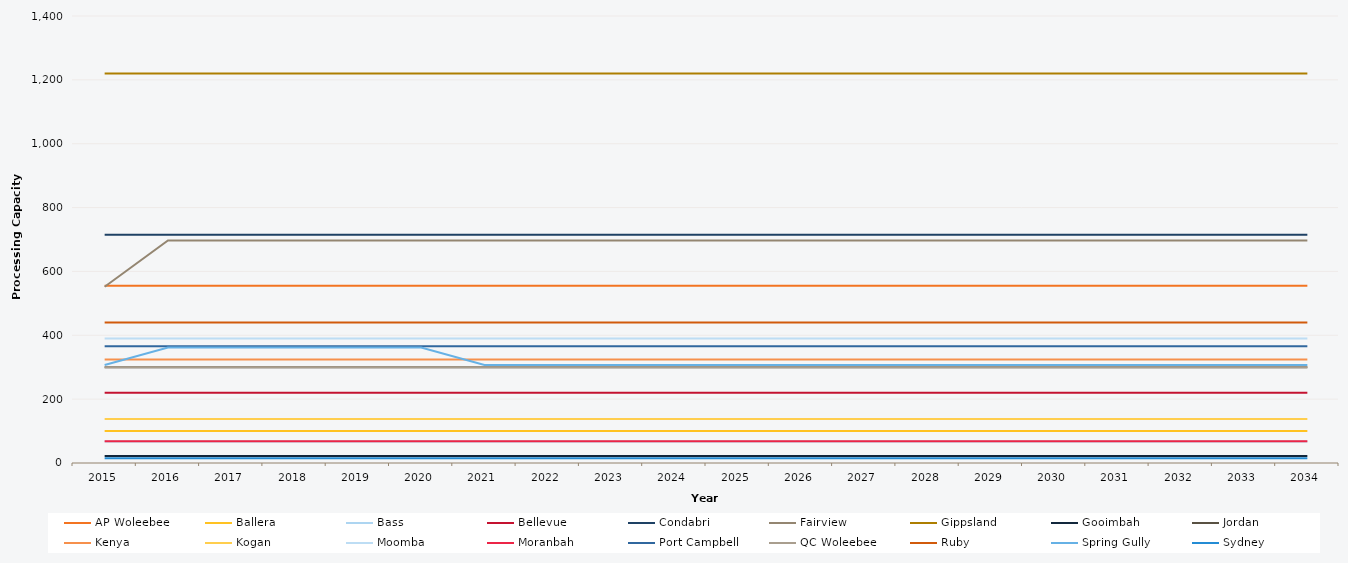
| Category | AP Woleebee | Ballera | Bass | Bellevue | Condabri | Fairview | Gippsland | Gooimbah | Jordan | Kenya | Kogan | Moomba | Moranbah | Port Campbell | QC Woleebee | Ruby | Spring Gully | Sydney |
|---|---|---|---|---|---|---|---|---|---|---|---|---|---|---|---|---|---|---|
| 2015.0 | 555 | 100 | 67 | 220 | 715 | 552 | 1220 | 22 | 300 | 324 | 138 | 390 | 68 | 366 | 300 | 440 | 307 | 15 |
| 2016.0 | 555 | 100 | 67 | 220 | 715 | 697 | 1220 | 22 | 300 | 324 | 138 | 390 | 68 | 366 | 300 | 440 | 362 | 15 |
| 2017.0 | 555 | 100 | 67 | 220 | 715 | 697 | 1220 | 22 | 300 | 324 | 138 | 390 | 68 | 366 | 300 | 440 | 362 | 15 |
| 2018.0 | 555 | 100 | 67 | 220 | 715 | 697 | 1220 | 22 | 300 | 324 | 138 | 390 | 68 | 366 | 300 | 440 | 362 | 15 |
| 2019.0 | 555 | 100 | 67 | 220 | 715 | 697 | 1220 | 22 | 300 | 324 | 138 | 390 | 68 | 366 | 300 | 440 | 362 | 15 |
| 2020.0 | 555 | 100 | 67 | 220 | 715 | 697 | 1220 | 22 | 300 | 324 | 138 | 390 | 68 | 366 | 300 | 440 | 362 | 15 |
| 2021.0 | 555 | 100 | 67 | 220 | 715 | 697 | 1220 | 22 | 300 | 324 | 138 | 390 | 68 | 366 | 300 | 440 | 307 | 15 |
| 2022.0 | 555 | 100 | 67 | 220 | 715 | 697 | 1220 | 22 | 300 | 324 | 138 | 390 | 68 | 366 | 300 | 440 | 307 | 15 |
| 2023.0 | 555 | 100 | 67 | 220 | 715 | 697 | 1220 | 22 | 300 | 324 | 138 | 390 | 68 | 366 | 300 | 440 | 307 | 15 |
| 2024.0 | 555 | 100 | 67 | 220 | 715 | 697 | 1220 | 22 | 300 | 324 | 138 | 390 | 68 | 366 | 300 | 440 | 307 | 15 |
| 2025.0 | 555 | 100 | 67 | 220 | 715 | 697 | 1220 | 22 | 300 | 324 | 138 | 390 | 68 | 366 | 300 | 440 | 307 | 15 |
| 2026.0 | 555 | 100 | 67 | 220 | 715 | 697 | 1220 | 22 | 300 | 324 | 138 | 390 | 68 | 366 | 300 | 440 | 307 | 15 |
| 2027.0 | 555 | 100 | 67 | 220 | 715 | 697 | 1220 | 22 | 300 | 324 | 138 | 390 | 68 | 366 | 300 | 440 | 307 | 15 |
| 2028.0 | 555 | 100 | 67 | 220 | 715 | 697 | 1220 | 22 | 300 | 324 | 138 | 390 | 68 | 366 | 300 | 440 | 307 | 15 |
| 2029.0 | 555 | 100 | 67 | 220 | 715 | 697 | 1220 | 22 | 300 | 324 | 138 | 390 | 68 | 366 | 300 | 440 | 307 | 15 |
| 2030.0 | 555 | 100 | 67 | 220 | 715 | 697 | 1220 | 22 | 300 | 324 | 138 | 390 | 68 | 366 | 300 | 440 | 307 | 15 |
| 2031.0 | 555 | 100 | 67 | 220 | 715 | 697 | 1220 | 22 | 300 | 324 | 138 | 390 | 68 | 366 | 300 | 440 | 307 | 15 |
| 2032.0 | 555 | 100 | 67 | 220 | 715 | 697 | 1220 | 22 | 300 | 324 | 138 | 390 | 68 | 366 | 300 | 440 | 307 | 15 |
| 2033.0 | 555 | 100 | 67 | 220 | 715 | 697 | 1220 | 22 | 300 | 324 | 138 | 390 | 68 | 366 | 300 | 440 | 307 | 15 |
| 2034.0 | 555 | 100 | 67 | 220 | 715 | 697 | 1220 | 22 | 300 | 324 | 138 | 390 | 68 | 366 | 300 | 440 | 307 | 15 |